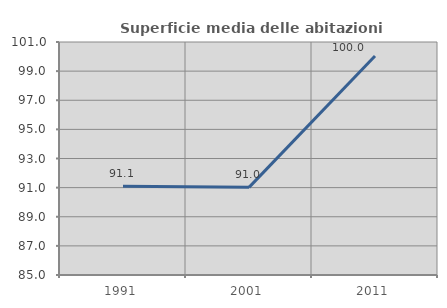
| Category | Superficie media delle abitazioni occupate |
|---|---|
| 1991.0 | 91.087 |
| 2001.0 | 91.019 |
| 2011.0 | 100.044 |